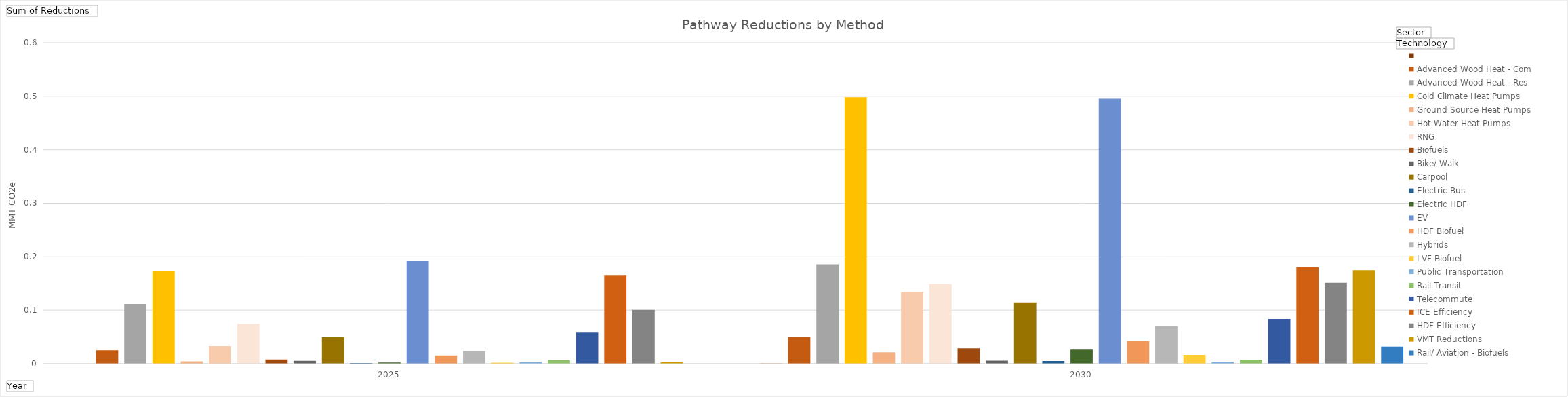
| Category | Electric | Thermal - Advanced Wood Heat - Com | Thermal - Advanced Wood Heat - Res | Thermal - Cold Climate Heat Pumps | Thermal - Ground Source Heat Pumps | Thermal - Hot Water Heat Pumps | Thermal - RNG | Thermal - Biofuels | Transportation - Bike/ Walk | Transportation - Carpool | Transportation - Electric Bus | Transportation - Electric HDF | Transportation - EV | Transportation - HDF Biofuel | Transportation - Hybrids | Transportation - LVF Biofuel | Transportation - Public Transportation | Transportation - Rail Transit | Transportation - Telecommute | Transportation - ICE Efficiency | Transportation - HDF Efficiency | Transportation - VMT Reductions | Transportation - Rail/ Aviation - Biofuels |
|---|---|---|---|---|---|---|---|---|---|---|---|---|---|---|---|---|---|---|---|---|---|---|---|
| 2025 | 0 | 0.025 | 0.111 | 0.172 | 0.004 | 0.033 | 0.074 | 0.008 | 0.006 | 0.05 | 0.001 | 0.002 | 0.193 | 0.016 | 0.024 | 0.002 | 0.003 | 0.007 | 0.059 | 0.166 | 0.101 | 0.003 | 0 |
| 2030 | 0 | 0.051 | 0.186 | 0.498 | 0.021 | 0.134 | 0.149 | 0.029 | 0.006 | 0.114 | 0.005 | 0.026 | 0.495 | 0.042 | 0.07 | 0.016 | 0.004 | 0.007 | 0.084 | 0.18 | 0.151 | 0.175 | 0.032 |